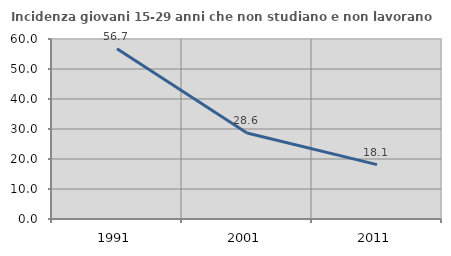
| Category | Incidenza giovani 15-29 anni che non studiano e non lavorano  |
|---|---|
| 1991.0 | 56.743 |
| 2001.0 | 28.649 |
| 2011.0 | 18.121 |